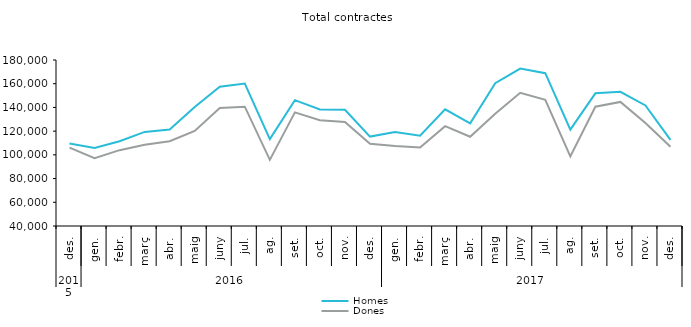
| Category | Homes | Dones |
|---|---|---|
| 0 | 109542 | 106105 |
| 1 | 105715 | 97179 |
| 2 | 111439 | 103954 |
| 3 | 119348 | 108465 |
| 4 | 121402 | 111539 |
| 5 | 140342 | 120229 |
| 6 | 157406 | 139485 |
| 7 | 160205 | 140647 |
| 8 | 113317 | 95771 |
| 9 | 146110 | 135822 |
| 10 | 138280 | 129162 |
| 11 | 138089 | 127801 |
| 12 | 115428 | 109423 |
| 13 | 119167 | 107423 |
| 14 | 116084 | 106285 |
| 15 | 138415 | 124206 |
| 16 | 126573 | 115247 |
| 17 | 160488 | 134654 |
| 18 | 172769 | 152363 |
| 19 | 168857 | 146370 |
| 20 | 121233 | 98651 |
| 21 | 151882 | 140579 |
| 22 | 153219 | 144630 |
| 23 | 141666 | 126940 |
| 24 | 112680 | 106778 |